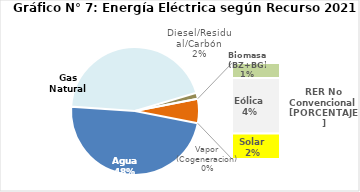
| Category | Series 0 |
|---|---|
| Agua | 2351.818 |
| Gas Natural | 2172.686 |
| Diesel/Residual/Carbón | 73.723 |
| Vapor (Cogeneracion) | 0.25 |
| Biomasa (BZ+BG) | 47.626 |
| Eólica | 174.55 |
| Solar | 80.833 |